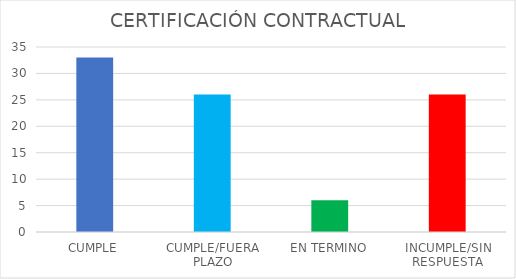
| Category | TOTAL |
|---|---|
| CUMPLE | 33 |
| CUMPLE/FUERA PLAZO | 26 |
| EN TERMINO | 6 |
| INCUMPLE/SIN RESPUESTA | 26 |